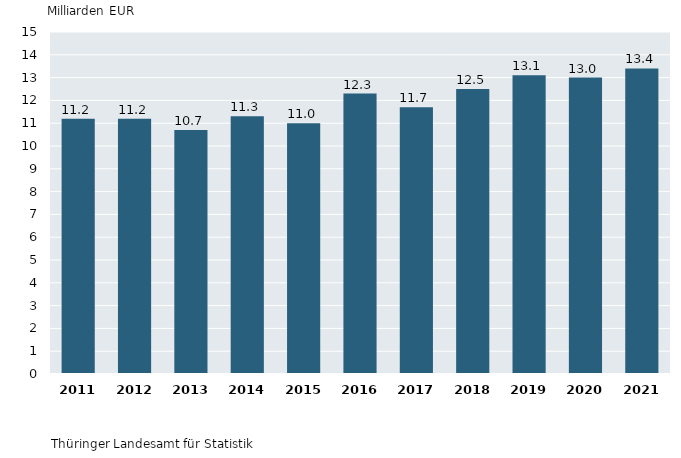
| Category | 1. Bruttoanlageinvestitionen in jeweiligen Preisen in Thüringen 2011 bis 2021 |
|---|---|
| 2011.0 | 11.2 |
| 2012.0 | 11.2 |
| 2013.0 | 10.7 |
| 2014.0 | 11.3 |
| 2015.0 | 11 |
| 2016.0 | 12.3 |
| 2017.0 | 11.7 |
| 2018.0 | 12.5 |
| 2019.0 | 13.1 |
| 2020.0 | 13 |
| 2021.0 | 13.4 |